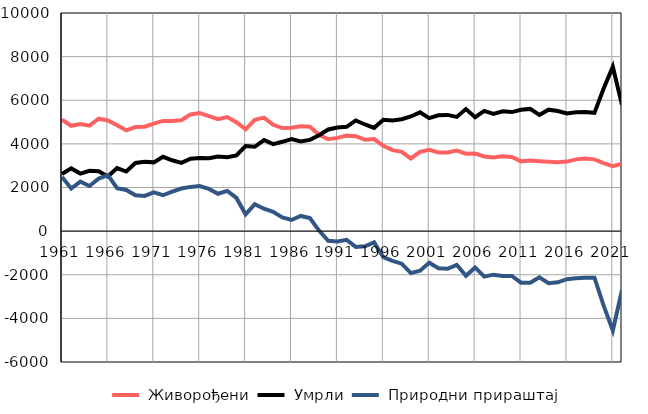
| Category |  Живорођени |  Умрли |  Природни прираштај |
|---|---|---|---|
| 1961.0 | 5105 | 2618 | 2487 |
| 1962.0 | 4830 | 2876 | 1954 |
| 1963.0 | 4910 | 2639 | 2271 |
| 1964.0 | 4835 | 2765 | 2070 |
| 1965.0 | 5154 | 2744 | 2410 |
| 1966.0 | 5075 | 2505 | 2570 |
| 1967.0 | 4857 | 2890 | 1967 |
| 1968.0 | 4620 | 2733 | 1887 |
| 1969.0 | 4771 | 3123 | 1648 |
| 1970.0 | 4787 | 3176 | 1611 |
| 1971.0 | 4929 | 3153 | 1776 |
| 1972.0 | 5052 | 3407 | 1645 |
| 1973.0 | 5053 | 3247 | 1806 |
| 1974.0 | 5083 | 3130 | 1953 |
| 1975.0 | 5351 | 3323 | 2028 |
| 1976.0 | 5414 | 3349 | 2065 |
| 1977.0 | 5274 | 3338 | 1936 |
| 1978.0 | 5134 | 3420 | 1714 |
| 1979.0 | 5231 | 3387 | 1844 |
| 1980.0 | 4990 | 3468 | 1522 |
| 1981.0 | 4667 | 3897 | 770 |
| 1982.0 | 5103 | 3865 | 1238 |
| 1983.0 | 5204 | 4176 | 1028 |
| 1984.0 | 4873 | 3987 | 886 |
| 1985.0 | 4726 | 4095 | 631 |
| 1986.0 | 4736 | 4225 | 511 |
| 1987.0 | 4805 | 4110 | 695 |
| 1988.0 | 4783 | 4182 | 601 |
| 1989.0 | 4419 | 4393 | 26 |
| 1990.0 | 4214 | 4659 | -445 |
| 1991.0 | 4275 | 4746 | -471 |
| 1992.0 | 4378 | 4780 | -402 |
| 1993.0 | 4350 | 5075 | -725 |
| 1994.0 | 4194 | 4889 | -695 |
| 1995.0 | 4219 | 4734 | -515 |
| 1996.0 | 3911 | 5107 | -1196 |
| 1997.0 | 3712 | 5073 | -1361 |
| 1998.0 | 3637 | 5129 | -1492 |
| 1999.0 | 3331 | 5257 | -1926 |
| 2000.0 | 3635 | 5447 | -1812 |
| 2001.0 | 3727 | 5180 | -1453 |
| 2002.0 | 3610 | 5313 | -1703 |
| 2003.0 | 3603 | 5329 | -1726 |
| 2004.0 | 3691 | 5235 | -1544 |
| 2005.0 | 3550 | 5597 | -2047 |
| 2006.0 | 3558 | 5223 | -1665 |
| 2007.0 | 3425 | 5510 | -2085 |
| 2008.0 | 3380 | 5376 | -1996 |
| 2009.0 | 3436 | 5495 | -2059 |
| 2010.0 | 3400 | 5457 | -2057 |
| 2011.0 | 3199 | 5565 | -2366 |
| 2012.0 | 3238 | 5603 | -2365 |
| 2013.0 | 3208 | 5328 | -2120 |
| 2014.0 | 3180 | 5569 | -2389 |
| 2015.0 | 3160 | 5506 | -2346 |
| 2016.0 | 3188 | 5392 | -2204 |
| 2017.0 | 3290 | 5452 | -2162 |
| 2018.0 | 3331 | 5464 | -2133 |
| 2019.0 | 3290 | 5423 | -2133 |
| 2020.0 | 3116 | 6535 | -3419 |
| 2021.0 | 2982 | 7536 | -4554 |
| 2022.0 | 3089 | 5788 | -2699 |